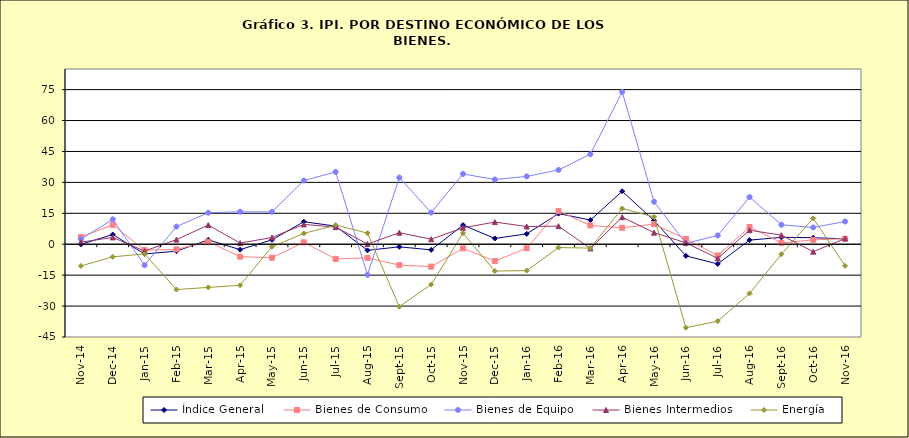
| Category | Índice General | Bienes de Consumo | Bienes de Equipo | Bienes Intermedios | Energía |
|---|---|---|---|---|---|
| 2014-11-02 | -0.062 | 3.502 | 2.422 | 0.977 | -10.538 |
| 2014-12-03 | 4.714 | 9.422 | 12.085 | 3.309 | -6.111 |
| 2015-01-01 | -4.714 | -2.855 | -10.186 | -3.319 | -4.678 |
| 2015-02-02 | -3.374 | -2.493 | 8.555 | 2.247 | -21.984 |
| 2015-03-03 | 2.131 | 1.203 | 15.281 | 9.3 | -20.948 |
| 2015-04-04 | -2.63 | -6.03 | 15.752 | 0.561 | -19.901 |
| 2015-05-05 | 2.125 | -6.529 | 15.704 | 3.256 | -1.239 |
| 2015-06-06 | 10.902 | 0.91 | 30.872 | 9.621 | 5.228 |
| 2015-07-07 | 8.793 | -7.107 | 35.085 | 8.305 | 9.286 |
| 2015-08-08 | -2.962 | -6.613 | -14.841 | 0.112 | 5.376 |
| 2015-09-09 | -1.256 | -10.141 | 32.343 | 5.602 | -30.267 |
| 2015-10-10 | -2.727 | -10.858 | 15.36 | 2.447 | -19.543 |
| 2015-11-01 | 9.284 | -1.991 | 34.093 | 7.964 | 5.354 |
| 2015-12-02 | 2.805 | -8.175 | 31.408 | 10.746 | -13.016 |
| 2016-01-01 | 5.027 | -1.96 | 32.892 | 8.608 | -12.792 |
| 2016-02-02 | 14.862 | 16.078 | 36.032 | 8.761 | -1.615 |
| 2016-03-03 | 11.716 | 9.106 | 43.694 | -2.035 | -1.868 |
| 2016-04-04 | 25.706 | 7.991 | 73.903 | 13.136 | 17.325 |
| 2016-05-05 | 11.507 | 9.748 | 20.6 | 5.623 | 13.239 |
| 2016-06-06 | -5.65 | 2.55 | 0.417 | 0.684 | -40.48 |
| 2016-07-07 | -9.559 | -5.474 | 4.264 | -6.863 | -37.333 |
| 2016-08-08 | 1.995 | 8.358 | 22.861 | 6.807 | -23.865 |
| 2016-09-09 | 3.335 | 0.656 | 9.44 | 4.376 | -4.862 |
| 2016-10-10 | 3.167 | 2.136 | 8.128 | -3.621 | 12.575 |
| 2016-11-11 | 2.596 | 2.692 | 11.025 | 2.769 | -10.508 |